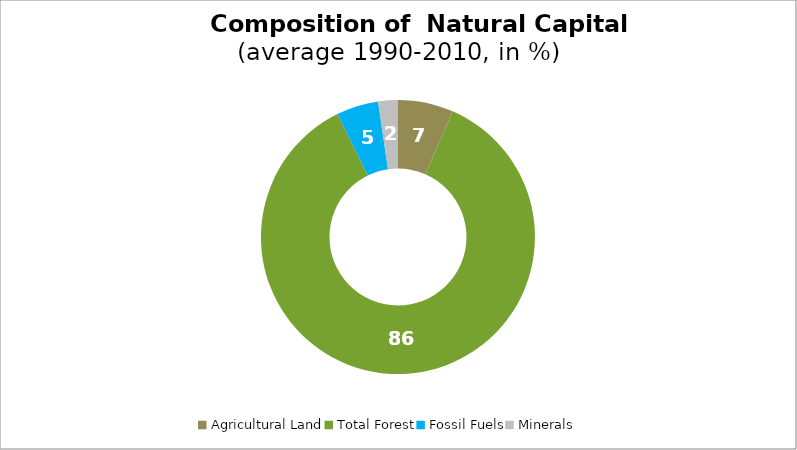
| Category | Series 0 |
|---|---|
| Agricultural Land | 6.524 |
| Total Forest | 86.197 |
| Fossil Fuels | 4.949 |
| Minerals | 2.33 |